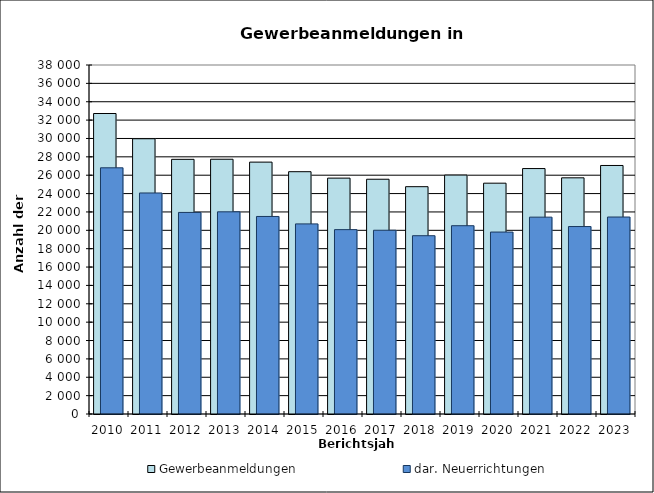
| Category | Gewerbeanmeldungen | dar. Neuerrichtungen |
|---|---|---|
| 2010.0 | 32718 | 26806 |
| 2011.0 | 29971 | 24066 |
| 2012.0 | 27728 | 21948 |
| 2013.0 | 27739 | 22013 |
| 2014.0 | 27426 | 21509 |
| 2015.0 | 26383 | 20698 |
| 2016.0 | 25683 | 20075 |
| 2017.0 | 25561 | 20008 |
| 2018.0 | 24752 | 19413 |
| 2019.0 | 26015 | 20501 |
| 2020.0 | 25132 | 19811 |
| 2021.0 | 26724 | 21433 |
| 2022.0 | 25716 | 20411 |
| 2023.0 | 27060 | 21448 |